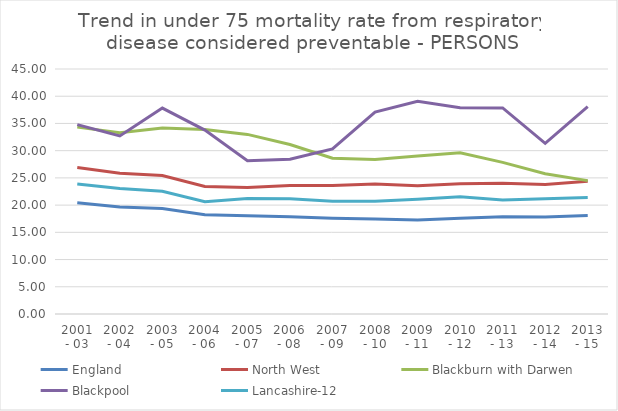
| Category | England | North West | Blackburn with Darwen | Blackpool | Lancashire-12 |
|---|---|---|---|---|---|
| 2001 - 03 | 20.443 | 26.914 | 34.323 | 34.783 | 23.888 |
| 2002 - 04 | 19.66 | 25.851 | 33.293 | 32.7 | 23.037 |
| 2003 - 05 | 19.365 | 25.44 | 34.154 | 37.82 | 22.56 |
| 2004 - 06 | 18.241 | 23.419 | 33.873 | 33.772 | 20.615 |
| 2005 - 07 | 18.035 | 23.257 | 32.989 | 28.137 | 21.191 |
| 2006 - 08 | 17.862 | 23.624 | 31.13 | 28.432 | 21.155 |
| 2007 - 09 | 17.577 | 23.597 | 28.618 | 30.312 | 20.69 |
| 2008 - 10 | 17.441 | 23.874 | 28.392 | 37.08 | 20.707 |
| 2009 - 11 | 17.246 | 23.579 | 29.023 | 39.088 | 21.074 |
| 2010 - 12 | 17.582 | 23.94 | 29.603 | 37.877 | 21.555 |
| 2011 - 13 | 17.853 | 24.018 | 27.854 | 37.847 | 20.955 |
| 2012 - 14 | 17.828 | 23.768 | 25.767 | 31.336 | 21.177 |
| 2013 - 15 | 18.09 | 24.366 | 24.498 | 38.076 | 21.393 |